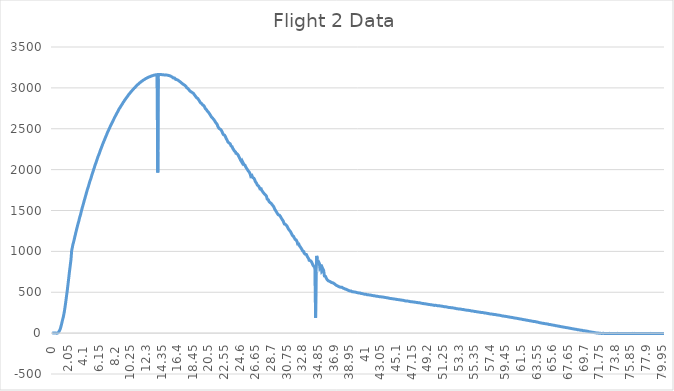
| Category | Series 0 |
|---|---|
| 0.0 | 1 |
| 0.05 | 0 |
| 0.1 | -1 |
| 0.15 | 1 |
| 0.2 | 1 |
| 0.25 | 1 |
| 0.3 | 1 |
| 0.35 | 1 |
| 0.4 | 1 |
| 0.45 | 2 |
| 0.5 | 1 |
| 0.55 | 1 |
| 0.6 | -2 |
| 0.65 | -7 |
| 0.7 | 0 |
| 0.75 | 3 |
| 0.8 | 6 |
| 0.85 | 12 |
| 0.9 | 20 |
| 0.95 | 29 |
| 1.0 | 38 |
| 1.05 | 50 |
| 1.1 | 63 |
| 1.15 | 82 |
| 1.2 | 99 |
| 1.25 | 118 |
| 1.3 | 140 |
| 1.35 | 158 |
| 1.4 | 176 |
| 1.45 | 194 |
| 1.5 | 218 |
| 1.55 | 241 |
| 1.6 | 267 |
| 1.65 | 297 |
| 1.7 | 328 |
| 1.75 | 362 |
| 1.8 | 396 |
| 1.85 | 432 |
| 1.9 | 468 |
| 1.95 | 502 |
| 2.0 | 538 |
| 2.05 | 579 |
| 2.1 | 617 |
| 2.15 | 657 |
| 2.2 | 698 |
| 2.25 | 740 |
| 2.3 | 777 |
| 2.35 | 813 |
| 2.4 | 851 |
| 2.45 | 889 |
| 2.5 | 939 |
| 2.55 | 1004 |
| 2.6 | 1030 |
| 2.65 | 1051 |
| 2.7 | 1077 |
| 2.75 | 1095 |
| 2.8 | 1111 |
| 2.85 | 1131 |
| 2.9 | 1150 |
| 2.95 | 1172 |
| 3.0 | 1191 |
| 3.05 | 1208 |
| 3.1 | 1231 |
| 3.15 | 1249 |
| 3.2 | 1268 |
| 3.25 | 1287 |
| 3.3 | 1305 |
| 3.35 | 1324 |
| 3.4 | 1341 |
| 3.45 | 1357 |
| 3.5 | 1373 |
| 3.55 | 1395 |
| 3.6 | 1413 |
| 3.65 | 1430 |
| 3.7 | 1444 |
| 3.75 | 1462 |
| 3.8 | 1482 |
| 3.85 | 1500 |
| 3.9 | 1518 |
| 3.95 | 1537 |
| 4.0 | 1552 |
| 4.05 | 1567 |
| 4.1 | 1585 |
| 4.15 | 1602 |
| 4.2 | 1620 |
| 4.25 | 1636 |
| 4.3 | 1652 |
| 4.35 | 1669 |
| 4.4 | 1685 |
| 4.45 | 1702 |
| 4.5 | 1719 |
| 4.55 | 1735 |
| 4.6 | 1752 |
| 4.65 | 1766 |
| 4.7 | 1780 |
| 4.75 | 1795 |
| 4.8 | 1811 |
| 4.85 | 1827 |
| 4.9 | 1844 |
| 4.95 | 1859 |
| 5.0 | 1872 |
| 5.05 | 1885 |
| 5.1 | 1899 |
| 5.15 | 1916 |
| 5.2 | 1933 |
| 5.25 | 1947 |
| 5.3 | 1961 |
| 5.35 | 1975 |
| 5.4 | 1989 |
| 5.45 | 2005 |
| 5.5 | 2018 |
| 5.55 | 2032 |
| 5.6 | 2048 |
| 5.65 | 2059 |
| 5.7 | 2074 |
| 5.75 | 2086 |
| 5.8 | 2100 |
| 5.85 | 2114 |
| 5.9 | 2128 |
| 5.95 | 2143 |
| 6.0 | 2156 |
| 6.05 | 2169 |
| 6.1 | 2181 |
| 6.15 | 2191 |
| 6.2 | 2202 |
| 6.25 | 2217 |
| 6.3 | 2230 |
| 6.35 | 2244 |
| 6.4 | 2256 |
| 6.45 | 2267 |
| 6.5 | 2280 |
| 6.55 | 2292 |
| 6.6 | 2305 |
| 6.65 | 2318 |
| 6.7 | 2329 |
| 6.75 | 2340 |
| 6.8 | 2350 |
| 6.85 | 2362 |
| 6.9 | 2373 |
| 6.95 | 2386 |
| 7.0 | 2398 |
| 7.05 | 2408 |
| 7.1 | 2419 |
| 7.15 | 2429 |
| 7.2 | 2442 |
| 7.25 | 2453 |
| 7.3 | 2465 |
| 7.35 | 2474 |
| 7.4 | 2484 |
| 7.45 | 2493 |
| 7.5 | 2504 |
| 7.55 | 2514 |
| 7.6 | 2525 |
| 7.65 | 2536 |
| 7.7 | 2544 |
| 7.75 | 2553 |
| 7.8 | 2563 |
| 7.85 | 2572 |
| 7.9 | 2583 |
| 7.95 | 2593 |
| 8.0 | 2602 |
| 8.05 | 2611 |
| 8.1 | 2621 |
| 8.15 | 2631 |
| 8.2 | 2640 |
| 8.25 | 2649 |
| 8.3 | 2658 |
| 8.35 | 2666 |
| 8.4 | 2675 |
| 8.45 | 2684 |
| 8.5 | 2693 |
| 8.55 | 2701 |
| 8.6 | 2710 |
| 8.65 | 2717 |
| 8.7 | 2727 |
| 8.75 | 2736 |
| 8.8 | 2746 |
| 8.85 | 2750 |
| 8.9 | 2759 |
| 8.95 | 2767 |
| 9.0 | 2775 |
| 9.05 | 2783 |
| 9.1 | 2789 |
| 9.15 | 2797 |
| 9.2 | 2804 |
| 9.25 | 2813 |
| 9.3 | 2820 |
| 9.35 | 2827 |
| 9.4 | 2833 |
| 9.45 | 2840 |
| 9.5 | 2848 |
| 9.55 | 2855 |
| 9.6 | 2860 |
| 9.65 | 2868 |
| 9.7 | 2874 |
| 9.75 | 2881 |
| 9.8 | 2887 |
| 9.85 | 2893 |
| 9.9 | 2899 |
| 9.95 | 2907 |
| 10.0 | 2914 |
| 10.05 | 2919 |
| 10.1 | 2925 |
| 10.15 | 2930 |
| 10.2 | 2936 |
| 10.25 | 2942 |
| 10.3 | 2948 |
| 10.35 | 2954 |
| 10.4 | 2959 |
| 10.45 | 2964 |
| 10.5 | 2967 |
| 10.55 | 2974 |
| 10.6 | 2980 |
| 10.65 | 2986 |
| 10.7 | 2991 |
| 10.75 | 2996 |
| 10.8 | 3001 |
| 10.85 | 3006 |
| 10.9 | 3009 |
| 10.95 | 3015 |
| 11.0 | 3020 |
| 11.05 | 3025 |
| 11.1 | 3031 |
| 11.15 | 3034 |
| 11.2 | 3039 |
| 11.25 | 3042 |
| 11.3 | 3045 |
| 11.35 | 3050 |
| 11.4 | 3055 |
| 11.45 | 3058 |
| 11.5 | 3063 |
| 11.55 | 3067 |
| 11.6 | 3070 |
| 11.65 | 3074 |
| 11.7 | 3077 |
| 11.75 | 3081 |
| 11.8 | 3084 |
| 11.85 | 3087 |
| 11.9 | 3091 |
| 11.95 | 3095 |
| 12.0 | 3096 |
| 12.05 | 3099 |
| 12.1 | 3102 |
| 12.15 | 3106 |
| 12.2 | 3108 |
| 12.25 | 3113 |
| 12.3 | 3113 |
| 12.35 | 3117 |
| 12.4 | 3119 |
| 12.45 | 3122 |
| 12.5 | 3124 |
| 12.55 | 3127 |
| 12.6 | 3129 |
| 12.65 | 3131 |
| 12.7 | 3134 |
| 12.75 | 3136 |
| 12.8 | 3136 |
| 12.85 | 3138 |
| 12.9 | 3141 |
| 12.95 | 3142 |
| 13.0 | 3145 |
| 13.05 | 3145 |
| 13.1 | 3148 |
| 13.15 | 3149 |
| 13.2 | 3150 |
| 13.25 | 3151 |
| 13.3 | 3154 |
| 13.35 | 3155 |
| 13.4 | 3155 |
| 13.45 | 3157 |
| 13.5 | 3158 |
| 13.55 | 3158 |
| 13.6 | 3160 |
| 13.65 | 3161 |
| 13.7 | 3161 |
| 13.75 | 3162 |
| 13.8 | 3164 |
| 13.85 | 1966 |
| 13.9 | 3113 |
| 13.95 | 3164 |
| 14.0 | 3164 |
| 14.05 | 3166 |
| 14.1 | 3164 |
| 14.15 | 3164 |
| 14.2 | 3164 |
| 14.25 | 3164 |
| 14.3 | 3162 |
| 14.35 | 3164 |
| 14.4 | 3161 |
| 14.45 | 3161 |
| 14.5 | 3160 |
| 14.55 | 3161 |
| 14.6 | 3160 |
| 14.65 | 3158 |
| 14.7 | 3158 |
| 14.75 | 3158 |
| 14.8 | 3158 |
| 14.85 | 3159 |
| 14.9 | 3157 |
| 14.95 | 3159 |
| 15.0 | 3157 |
| 15.05 | 3158 |
| 15.1 | 3155 |
| 15.15 | 3155 |
| 15.2 | 3155 |
| 15.25 | 3152 |
| 15.3 | 3151 |
| 15.35 | 3148 |
| 15.4 | 3145 |
| 15.45 | 3147 |
| 15.5 | 3145 |
| 15.55 | 3141 |
| 15.6 | 3140 |
| 15.65 | 3138 |
| 15.7 | 3135 |
| 15.75 | 3132 |
| 15.8 | 3128 |
| 15.85 | 3125 |
| 15.9 | 3120 |
| 15.95 | 3118 |
| 16.0 | 3120 |
| 16.05 | 3120 |
| 16.1 | 3116 |
| 16.15 | 3110 |
| 16.2 | 3104 |
| 16.25 | 3105 |
| 16.3 | 3104 |
| 16.35 | 3101 |
| 16.4 | 3100 |
| 16.45 | 3095 |
| 16.5 | 3094 |
| 16.55 | 3088 |
| 16.6 | 3085 |
| 16.65 | 3084 |
| 16.7 | 3080 |
| 16.75 | 3075 |
| 16.8 | 3073 |
| 16.85 | 3072 |
| 16.9 | 3068 |
| 16.95 | 3061 |
| 17.0 | 3057 |
| 17.05 | 3053 |
| 17.1 | 3050 |
| 17.15 | 3048 |
| 17.2 | 3043 |
| 17.25 | 3039 |
| 17.3 | 3037 |
| 17.35 | 3033 |
| 17.4 | 3031 |
| 17.45 | 3027 |
| 17.5 | 3022 |
| 17.55 | 3018 |
| 17.6 | 3010 |
| 17.65 | 3001 |
| 17.7 | 3000 |
| 17.75 | 2997 |
| 17.8 | 2993 |
| 17.85 | 2991 |
| 17.9 | 2983 |
| 17.95 | 2975 |
| 18.0 | 2970 |
| 18.05 | 2965 |
| 18.1 | 2959 |
| 18.15 | 2954 |
| 18.2 | 2955 |
| 18.25 | 2950 |
| 18.3 | 2951 |
| 18.35 | 2950 |
| 18.4 | 2941 |
| 18.45 | 2937 |
| 18.5 | 2935 |
| 18.55 | 2930 |
| 18.6 | 2924 |
| 18.65 | 2921 |
| 18.7 | 2909 |
| 18.75 | 2906 |
| 18.8 | 2901 |
| 18.85 | 2891 |
| 18.9 | 2888 |
| 18.95 | 2878 |
| 19.0 | 2877 |
| 19.05 | 2873 |
| 19.1 | 2870 |
| 19.15 | 2864 |
| 19.2 | 2856 |
| 19.25 | 2851 |
| 19.3 | 2841 |
| 19.35 | 2835 |
| 19.4 | 2829 |
| 19.45 | 2819 |
| 19.5 | 2818 |
| 19.55 | 2814 |
| 19.6 | 2807 |
| 19.65 | 2798 |
| 19.7 | 2796 |
| 19.75 | 2791 |
| 19.8 | 2786 |
| 19.85 | 2785 |
| 19.9 | 2781 |
| 19.95 | 2774 |
| 20.0 | 2765 |
| 20.05 | 2756 |
| 20.1 | 2744 |
| 20.15 | 2740 |
| 20.2 | 2737 |
| 20.25 | 2731 |
| 20.3 | 2726 |
| 20.35 | 2716 |
| 20.4 | 2713 |
| 20.45 | 2709 |
| 20.5 | 2701 |
| 20.55 | 2690 |
| 20.6 | 2688 |
| 20.65 | 2682 |
| 20.7 | 2674 |
| 20.75 | 2668 |
| 20.8 | 2658 |
| 20.85 | 2647 |
| 20.9 | 2642 |
| 20.95 | 2639 |
| 21.0 | 2631 |
| 21.05 | 2628 |
| 21.1 | 2626 |
| 21.15 | 2619 |
| 21.2 | 2613 |
| 21.25 | 2606 |
| 21.3 | 2599 |
| 21.35 | 2588 |
| 21.4 | 2581 |
| 21.45 | 2581 |
| 21.5 | 2571 |
| 21.55 | 2564 |
| 21.6 | 2558 |
| 21.65 | 2551 |
| 21.7 | 2534 |
| 21.75 | 2524 |
| 21.8 | 2515 |
| 21.85 | 2510 |
| 21.9 | 2505 |
| 21.95 | 2500 |
| 22.0 | 2497 |
| 22.05 | 2496 |
| 22.1 | 2491 |
| 22.15 | 2483 |
| 22.2 | 2478 |
| 22.25 | 2466 |
| 22.3 | 2459 |
| 22.35 | 2446 |
| 22.4 | 2436 |
| 22.45 | 2429 |
| 22.5 | 2428 |
| 22.55 | 2424 |
| 22.6 | 2422 |
| 22.65 | 2419 |
| 22.7 | 2410 |
| 22.75 | 2398 |
| 22.8 | 2383 |
| 22.85 | 2371 |
| 22.9 | 2368 |
| 22.95 | 2365 |
| 23.0 | 2356 |
| 23.05 | 2339 |
| 23.1 | 2337 |
| 23.15 | 2334 |
| 23.2 | 2326 |
| 23.25 | 2325 |
| 23.3 | 2323 |
| 23.35 | 2315 |
| 23.4 | 2305 |
| 23.45 | 2291 |
| 23.5 | 2285 |
| 23.55 | 2285 |
| 23.6 | 2280 |
| 23.65 | 2271 |
| 23.7 | 2257 |
| 23.75 | 2248 |
| 23.8 | 2244 |
| 23.85 | 2240 |
| 23.9 | 2227 |
| 23.95 | 2231 |
| 24.0 | 2231 |
| 24.05 | 2216 |
| 24.1 | 2200 |
| 24.15 | 2191 |
| 24.2 | 2191 |
| 24.25 | 2194 |
| 24.3 | 2194 |
| 24.35 | 2189 |
| 24.4 | 2177 |
| 24.45 | 2165 |
| 24.5 | 2156 |
| 24.55 | 2147 |
| 24.6 | 2138 |
| 24.65 | 2128 |
| 24.7 | 2117 |
| 24.75 | 2110 |
| 24.8 | 2102 |
| 24.85 | 2096 |
| 24.9 | 2086 |
| 24.95 | 2101 |
| 25.0 | 2092 |
| 25.05 | 2083 |
| 25.1 | 2074 |
| 25.15 | 2064 |
| 25.2 | 2061 |
| 25.25 | 2058 |
| 25.3 | 2052 |
| 25.35 | 2039 |
| 25.4 | 2029 |
| 25.45 | 2023 |
| 25.5 | 2020 |
| 25.55 | 2017 |
| 25.6 | 2002 |
| 25.65 | 1991 |
| 25.7 | 1986 |
| 25.75 | 1979 |
| 25.8 | 1974 |
| 25.85 | 1970 |
| 25.9 | 1965 |
| 25.95 | 1951 |
| 26.0 | 1934 |
| 26.05 | 1918 |
| 26.1 | 1909 |
| 26.15 | 1925 |
| 26.2 | 1927 |
| 26.25 | 1918 |
| 26.3 | 1903 |
| 26.35 | 1904 |
| 26.4 | 1900 |
| 26.45 | 1895 |
| 26.5 | 1886 |
| 26.55 | 1878 |
| 26.6 | 1868 |
| 26.65 | 1853 |
| 26.7 | 1845 |
| 26.75 | 1842 |
| 26.8 | 1834 |
| 26.85 | 1822 |
| 26.9 | 1811 |
| 26.95 | 1809 |
| 27.0 | 1803 |
| 27.05 | 1802 |
| 27.1 | 1802 |
| 27.15 | 1791 |
| 27.2 | 1778 |
| 27.25 | 1765 |
| 27.3 | 1767 |
| 27.35 | 1768 |
| 27.4 | 1766 |
| 27.45 | 1752 |
| 27.5 | 1744 |
| 27.55 | 1738 |
| 27.6 | 1733 |
| 27.65 | 1724 |
| 27.7 | 1714 |
| 27.75 | 1713 |
| 27.8 | 1707 |
| 27.85 | 1701 |
| 27.9 | 1695 |
| 27.95 | 1692 |
| 28.0 | 1690 |
| 28.05 | 1685 |
| 28.1 | 1676 |
| 28.15 | 1657 |
| 28.2 | 1640 |
| 28.25 | 1631 |
| 28.3 | 1633 |
| 28.35 | 1631 |
| 28.4 | 1621 |
| 28.45 | 1608 |
| 28.5 | 1604 |
| 28.55 | 1602 |
| 28.6 | 1596 |
| 28.65 | 1590 |
| 28.7 | 1585 |
| 28.75 | 1584 |
| 28.8 | 1578 |
| 28.85 | 1571 |
| 28.9 | 1565 |
| 28.95 | 1559 |
| 29.0 | 1554 |
| 29.05 | 1551 |
| 29.1 | 1537 |
| 29.15 | 1528 |
| 29.2 | 1514 |
| 29.25 | 1502 |
| 29.3 | 1500 |
| 29.35 | 1498 |
| 29.4 | 1485 |
| 29.45 | 1478 |
| 29.5 | 1468 |
| 29.55 | 1467 |
| 29.6 | 1458 |
| 29.65 | 1448 |
| 29.7 | 1448 |
| 29.75 | 1448 |
| 29.8 | 1443 |
| 29.85 | 1437 |
| 29.9 | 1434 |
| 29.95 | 1425 |
| 30.0 | 1416 |
| 30.05 | 1407 |
| 30.1 | 1397 |
| 30.15 | 1392 |
| 30.2 | 1391 |
| 30.25 | 1380 |
| 30.3 | 1371 |
| 30.35 | 1356 |
| 30.4 | 1348 |
| 30.45 | 1335 |
| 30.5 | 1332 |
| 30.55 | 1334 |
| 30.6 | 1330 |
| 30.65 | 1333 |
| 30.7 | 1325 |
| 30.75 | 1316 |
| 30.8 | 1310 |
| 30.85 | 1300 |
| 30.9 | 1291 |
| 30.95 | 1280 |
| 31.0 | 1273 |
| 31.05 | 1265 |
| 31.1 | 1262 |
| 31.15 | 1258 |
| 31.2 | 1249 |
| 31.25 | 1241 |
| 31.3 | 1235 |
| 31.35 | 1225 |
| 31.4 | 1214 |
| 31.45 | 1207 |
| 31.5 | 1195 |
| 31.55 | 1191 |
| 31.6 | 1184 |
| 31.65 | 1184 |
| 31.7 | 1179 |
| 31.75 | 1166 |
| 31.8 | 1160 |
| 31.85 | 1148 |
| 31.9 | 1144 |
| 31.95 | 1141 |
| 32.0 | 1140 |
| 32.05 | 1132 |
| 32.1 | 1131 |
| 32.15 | 1112 |
| 32.2 | 1089 |
| 32.25 | 1083 |
| 32.3 | 1092 |
| 32.35 | 1089 |
| 32.4 | 1072 |
| 32.45 | 1061 |
| 32.5 | 1064 |
| 32.55 | 1054 |
| 32.6 | 1043 |
| 32.65 | 1039 |
| 32.7 | 1036 |
| 32.75 | 1024 |
| 32.8 | 1013 |
| 32.85 | 1005 |
| 32.9 | 1014 |
| 32.95 | 1014 |
| 33.0 | 997 |
| 33.05 | 977 |
| 33.1 | 977 |
| 33.15 | 969 |
| 33.2 | 965 |
| 33.25 | 965 |
| 33.3 | 965 |
| 33.35 | 961 |
| 33.4 | 954 |
| 33.45 | 938 |
| 33.5 | 935 |
| 33.55 | 923 |
| 33.6 | 917 |
| 33.65 | 907 |
| 33.7 | 891 |
| 33.75 | 889 |
| 33.8 | 890 |
| 33.85 | 887 |
| 33.9 | 883 |
| 33.95 | 882 |
| 34.0 | 873 |
| 34.05 | 869 |
| 34.1 | 854 |
| 34.15 | 845 |
| 34.2 | 832 |
| 34.25 | 828 |
| 34.3 | 818 |
| 34.35 | 820 |
| 34.4 | 814 |
| 34.45 | 806 |
| 34.5 | 799 |
| 34.55 | 187 |
| 34.6 | 751 |
| 34.65 | 829 |
| 34.7 | 945 |
| 34.75 | 895 |
| 34.8 | 862 |
| 34.85 | 873 |
| 34.9 | 873 |
| 34.95 | 871 |
| 35.0 | 870 |
| 35.05 | 850 |
| 35.1 | 803 |
| 35.15 | 815 |
| 35.2 | 821 |
| 35.25 | 839 |
| 35.3 | 795 |
| 35.35 | 759 |
| 35.4 | 763 |
| 35.45 | 773 |
| 35.5 | 787 |
| 35.55 | 780 |
| 35.6 | 767 |
| 35.65 | 738 |
| 35.7 | 699 |
| 35.75 | 690 |
| 35.8 | 694 |
| 35.85 | 693 |
| 35.9 | 689 |
| 35.95 | 673 |
| 36.0 | 685 |
| 36.05 | 655 |
| 36.1 | 655 |
| 36.15 | 644 |
| 36.2 | 640 |
| 36.25 | 644 |
| 36.3 | 629 |
| 36.35 | 635 |
| 36.4 | 634 |
| 36.45 | 634 |
| 36.5 | 628 |
| 36.55 | 622 |
| 36.6 | 619 |
| 36.65 | 618 |
| 36.7 | 615 |
| 36.75 | 611 |
| 36.8 | 616 |
| 36.85 | 609 |
| 36.9 | 610 |
| 36.95 | 607 |
| 37.0 | 601 |
| 37.05 | 614 |
| 37.1 | 598 |
| 37.15 | 590 |
| 37.2 | 588 |
| 37.25 | 585 |
| 37.3 | 584 |
| 37.35 | 579 |
| 37.4 | 579 |
| 37.45 | 575 |
| 37.5 | 573 |
| 37.55 | 571 |
| 37.6 | 570 |
| 37.65 | 566 |
| 37.7 | 564 |
| 37.75 | 562 |
| 37.8 | 560 |
| 37.85 | 562 |
| 37.9 | 562 |
| 37.95 | 563 |
| 38.0 | 561 |
| 38.05 | 558 |
| 38.1 | 554 |
| 38.15 | 551 |
| 38.2 | 547 |
| 38.25 | 546 |
| 38.3 | 545 |
| 38.35 | 542 |
| 38.4 | 539 |
| 38.45 | 539 |
| 38.5 | 537 |
| 38.55 | 538 |
| 38.6 | 535 |
| 38.65 | 531 |
| 38.7 | 527 |
| 38.75 | 528 |
| 38.8 | 524 |
| 38.85 | 523 |
| 38.9 | 521 |
| 38.95 | 518 |
| 39.0 | 516 |
| 39.05 | 516 |
| 39.1 | 517 |
| 39.15 | 515 |
| 39.2 | 515 |
| 39.25 | 515 |
| 39.3 | 509 |
| 39.35 | 506 |
| 39.4 | 506 |
| 39.45 | 505 |
| 39.5 | 505 |
| 39.55 | 503 |
| 39.6 | 504 |
| 39.65 | 503 |
| 39.7 | 501 |
| 39.75 | 500 |
| 39.8 | 501 |
| 39.85 | 498 |
| 39.9 | 497 |
| 39.95 | 496 |
| 40.0 | 495 |
| 40.05 | 495 |
| 40.1 | 494 |
| 40.15 | 493 |
| 40.2 | 491 |
| 40.25 | 490 |
| 40.3 | 491 |
| 40.35 | 491 |
| 40.4 | 490 |
| 40.45 | 490 |
| 40.5 | 487 |
| 40.55 | 484 |
| 40.6 | 485 |
| 40.65 | 484 |
| 40.7 | 483 |
| 40.75 | 482 |
| 40.8 | 480 |
| 40.85 | 478 |
| 40.9 | 479 |
| 40.95 | 478 |
| 41.0 | 476 |
| 41.05 | 476 |
| 41.1 | 474 |
| 41.15 | 475 |
| 41.2 | 472 |
| 41.25 | 471 |
| 41.3 | 470 |
| 41.35 | 470 |
| 41.4 | 470 |
| 41.45 | 469 |
| 41.5 | 467 |
| 41.55 | 468 |
| 41.6 | 467 |
| 41.65 | 467 |
| 41.7 | 468 |
| 41.75 | 465 |
| 41.8 | 465 |
| 41.85 | 462 |
| 41.9 | 462 |
| 41.95 | 461 |
| 42.0 | 460 |
| 42.05 | 459 |
| 42.1 | 459 |
| 42.15 | 458 |
| 42.2 | 458 |
| 42.25 | 457 |
| 42.3 | 456 |
| 42.35 | 455 |
| 42.4 | 454 |
| 42.45 | 452 |
| 42.5 | 452 |
| 42.55 | 452 |
| 42.6 | 451 |
| 42.65 | 451 |
| 42.7 | 450 |
| 42.75 | 449 |
| 42.8 | 448 |
| 42.85 | 448 |
| 42.9 | 447 |
| 42.95 | 445 |
| 43.0 | 445 |
| 43.05 | 444 |
| 43.1 | 445 |
| 43.15 | 443 |
| 43.2 | 443 |
| 43.25 | 442 |
| 43.3 | 442 |
| 43.35 | 441 |
| 43.4 | 441 |
| 43.45 | 437 |
| 43.5 | 437 |
| 43.55 | 438 |
| 43.6 | 438 |
| 43.65 | 436 |
| 43.7 | 436 |
| 43.75 | 434 |
| 43.8 | 433 |
| 43.85 | 433 |
| 43.9 | 431 |
| 43.95 | 430 |
| 44.0 | 431 |
| 44.05 | 430 |
| 44.1 | 428 |
| 44.15 | 428 |
| 44.2 | 428 |
| 44.25 | 426 |
| 44.3 | 425 |
| 44.35 | 424 |
| 44.4 | 424 |
| 44.45 | 423 |
| 44.5 | 424 |
| 44.55 | 423 |
| 44.6 | 421 |
| 44.65 | 421 |
| 44.7 | 420 |
| 44.75 | 419 |
| 44.8 | 419 |
| 44.85 | 417 |
| 44.9 | 417 |
| 44.95 | 416 |
| 45.0 | 416 |
| 45.05 | 415 |
| 45.1 | 415 |
| 45.15 | 413 |
| 45.2 | 412 |
| 45.25 | 412 |
| 45.3 | 411 |
| 45.35 | 410 |
| 45.4 | 409 |
| 45.45 | 407 |
| 45.5 | 409 |
| 45.55 | 407 |
| 45.6 | 405 |
| 45.65 | 406 |
| 45.7 | 405 |
| 45.75 | 404 |
| 45.8 | 404 |
| 45.85 | 405 |
| 45.9 | 403 |
| 45.95 | 402 |
| 46.0 | 402 |
| 46.05 | 401 |
| 46.1 | 400 |
| 46.15 | 397 |
| 46.2 | 397 |
| 46.25 | 395 |
| 46.3 | 396 |
| 46.35 | 394 |
| 46.4 | 394 |
| 46.45 | 394 |
| 46.5 | 395 |
| 46.55 | 393 |
| 46.6 | 392 |
| 46.65 | 391 |
| 46.7 | 391 |
| 46.75 | 389 |
| 46.8 | 389 |
| 46.85 | 388 |
| 46.9 | 387 |
| 46.95 | 386 |
| 47.0 | 385 |
| 47.05 | 384 |
| 47.1 | 384 |
| 47.15 | 384 |
| 47.2 | 383 |
| 47.25 | 384 |
| 47.3 | 382 |
| 47.35 | 382 |
| 47.4 | 381 |
| 47.45 | 381 |
| 47.5 | 378 |
| 47.55 | 377 |
| 47.6 | 377 |
| 47.65 | 379 |
| 47.7 | 376 |
| 47.75 | 376 |
| 47.8 | 374 |
| 47.85 | 375 |
| 47.9 | 374 |
| 47.95 | 375 |
| 48.0 | 372 |
| 48.05 | 371 |
| 48.1 | 370 |
| 48.15 | 371 |
| 48.2 | 371 |
| 48.25 | 369 |
| 48.3 | 367 |
| 48.35 | 367 |
| 48.4 | 365 |
| 48.45 | 365 |
| 48.5 | 364 |
| 48.55 | 364 |
| 48.6 | 363 |
| 48.65 | 363 |
| 48.7 | 361 |
| 48.75 | 362 |
| 48.8 | 359 |
| 48.85 | 360 |
| 48.9 | 359 |
| 48.95 | 358 |
| 49.0 | 358 |
| 49.05 | 359 |
| 49.1 | 356 |
| 49.15 | 355 |
| 49.2 | 357 |
| 49.25 | 353 |
| 49.3 | 355 |
| 49.35 | 353 |
| 49.4 | 351 |
| 49.45 | 351 |
| 49.5 | 350 |
| 49.55 | 349 |
| 49.6 | 349 |
| 49.65 | 350 |
| 49.7 | 347 |
| 49.75 | 346 |
| 49.8 | 346 |
| 49.85 | 345 |
| 49.9 | 345 |
| 49.95 | 343 |
| 50.0 | 342 |
| 50.05 | 343 |
| 50.1 | 342 |
| 50.15 | 339 |
| 50.2 | 341 |
| 50.25 | 340 |
| 50.3 | 341 |
| 50.35 | 339 |
| 50.4 | 339 |
| 50.45 | 337 |
| 50.5 | 336 |
| 50.55 | 336 |
| 50.6 | 335 |
| 50.65 | 335 |
| 50.7 | 334 |
| 50.75 | 335 |
| 50.8 | 334 |
| 50.85 | 335 |
| 50.9 | 332 |
| 50.95 | 330 |
| 51.0 | 329 |
| 51.05 | 330 |
| 51.1 | 328 |
| 51.15 | 327 |
| 51.2 | 328 |
| 51.25 | 326 |
| 51.3 | 324 |
| 51.35 | 325 |
| 51.4 | 323 |
| 51.45 | 323 |
| 51.5 | 322 |
| 51.55 | 321 |
| 51.6 | 322 |
| 51.65 | 322 |
| 51.7 | 320 |
| 51.75 | 320 |
| 51.8 | 319 |
| 51.85 | 316 |
| 51.9 | 316 |
| 51.95 | 315 |
| 52.0 | 316 |
| 52.05 | 316 |
| 52.1 | 314 |
| 52.15 | 313 |
| 52.2 | 313 |
| 52.25 | 312 |
| 52.3 | 312 |
| 52.35 | 311 |
| 52.4 | 310 |
| 52.45 | 310 |
| 52.5 | 310 |
| 52.55 | 309 |
| 52.6 | 307 |
| 52.65 | 307 |
| 52.7 | 306 |
| 52.75 | 305 |
| 52.8 | 304 |
| 52.85 | 304 |
| 52.9 | 304 |
| 52.95 | 303 |
| 53.0 | 300 |
| 53.05 | 301 |
| 53.1 | 299 |
| 53.15 | 298 |
| 53.2 | 298 |
| 53.25 | 296 |
| 53.3 | 296 |
| 53.35 | 296 |
| 53.4 | 297 |
| 53.45 | 295 |
| 53.5 | 295 |
| 53.55 | 294 |
| 53.6 | 293 |
| 53.65 | 292 |
| 53.7 | 291 |
| 53.75 | 290 |
| 53.8 | 290 |
| 53.85 | 289 |
| 53.9 | 289 |
| 53.95 | 288 |
| 54.0 | 288 |
| 54.05 | 286 |
| 54.1 | 285 |
| 54.15 | 284 |
| 54.2 | 283 |
| 54.25 | 282 |
| 54.3 | 282 |
| 54.35 | 281 |
| 54.4 | 281 |
| 54.45 | 281 |
| 54.5 | 280 |
| 54.55 | 280 |
| 54.6 | 278 |
| 54.65 | 278 |
| 54.7 | 277 |
| 54.75 | 276 |
| 54.8 | 276 |
| 54.85 | 275 |
| 54.9 | 273 |
| 54.95 | 272 |
| 55.0 | 272 |
| 55.05 | 271 |
| 55.1 | 270 |
| 55.15 | 270 |
| 55.2 | 270 |
| 55.25 | 269 |
| 55.3 | 268 |
| 55.35 | 267 |
| 55.4 | 265 |
| 55.45 | 264 |
| 55.5 | 263 |
| 55.55 | 264 |
| 55.6 | 262 |
| 55.65 | 263 |
| 55.7 | 261 |
| 55.75 | 259 |
| 55.8 | 260 |
| 55.85 | 259 |
| 55.9 | 258 |
| 55.95 | 257 |
| 56.0 | 257 |
| 56.05 | 257 |
| 56.1 | 255 |
| 56.15 | 255 |
| 56.2 | 255 |
| 56.25 | 253 |
| 56.3 | 252 |
| 56.35 | 251 |
| 56.4 | 252 |
| 56.45 | 252 |
| 56.5 | 251 |
| 56.55 | 250 |
| 56.6 | 249 |
| 56.65 | 247 |
| 56.7 | 246 |
| 56.75 | 246 |
| 56.8 | 246 |
| 56.85 | 245 |
| 56.9 | 245 |
| 56.95 | 243 |
| 57.0 | 242 |
| 57.05 | 242 |
| 57.1 | 240 |
| 57.15 | 240 |
| 57.2 | 240 |
| 57.25 | 239 |
| 57.3 | 238 |
| 57.35 | 236 |
| 57.4 | 235 |
| 57.45 | 234 |
| 57.5 | 234 |
| 57.55 | 234 |
| 57.6 | 234 |
| 57.65 | 233 |
| 57.7 | 232 |
| 57.75 | 232 |
| 57.8 | 231 |
| 57.85 | 229 |
| 57.9 | 229 |
| 57.95 | 228 |
| 58.0 | 227 |
| 58.05 | 228 |
| 58.1 | 227 |
| 58.15 | 226 |
| 58.2 | 226 |
| 58.25 | 225 |
| 58.3 | 222 |
| 58.35 | 223 |
| 58.4 | 221 |
| 58.45 | 221 |
| 58.5 | 220 |
| 58.55 | 220 |
| 58.6 | 217 |
| 58.65 | 218 |
| 58.7 | 218 |
| 58.75 | 216 |
| 58.8 | 215 |
| 58.85 | 215 |
| 58.9 | 215 |
| 58.95 | 213 |
| 59.0 | 211 |
| 59.05 | 212 |
| 59.1 | 210 |
| 59.15 | 210 |
| 59.2 | 210 |
| 59.25 | 210 |
| 59.3 | 207 |
| 59.35 | 206 |
| 59.4 | 205 |
| 59.45 | 205 |
| 59.5 | 203 |
| 59.55 | 203 |
| 59.6 | 203 |
| 59.65 | 202 |
| 59.7 | 202 |
| 59.75 | 200 |
| 59.8 | 200 |
| 59.85 | 199 |
| 59.9 | 198 |
| 59.95 | 196 |
| 60.0 | 196 |
| 60.05 | 195 |
| 60.1 | 194 |
| 60.15 | 194 |
| 60.2 | 193 |
| 60.25 | 191 |
| 60.3 | 191 |
| 60.35 | 191 |
| 60.4 | 190 |
| 60.45 | 188 |
| 60.5 | 188 |
| 60.55 | 187 |
| 60.6 | 187 |
| 60.65 | 185 |
| 60.7 | 185 |
| 60.75 | 184 |
| 60.8 | 183 |
| 60.85 | 182 |
| 60.9 | 181 |
| 60.95 | 181 |
| 61.0 | 179 |
| 61.05 | 178 |
| 61.1 | 178 |
| 61.15 | 178 |
| 61.2 | 176 |
| 61.25 | 175 |
| 61.3 | 174 |
| 61.35 | 174 |
| 61.4 | 173 |
| 61.45 | 172 |
| 61.5 | 171 |
| 61.55 | 171 |
| 61.6 | 171 |
| 61.65 | 168 |
| 61.7 | 167 |
| 61.75 | 167 |
| 61.8 | 165 |
| 61.85 | 165 |
| 61.9 | 164 |
| 61.95 | 164 |
| 62.0 | 163 |
| 62.05 | 163 |
| 62.1 | 162 |
| 62.15 | 160 |
| 62.2 | 158 |
| 62.25 | 157 |
| 62.3 | 157 |
| 62.35 | 156 |
| 62.4 | 156 |
| 62.45 | 155 |
| 62.5 | 152 |
| 62.55 | 152 |
| 62.6 | 152 |
| 62.65 | 151 |
| 62.7 | 150 |
| 62.75 | 150 |
| 62.8 | 148 |
| 62.85 | 149 |
| 62.9 | 147 |
| 62.95 | 146 |
| 63.0 | 145 |
| 63.05 | 145 |
| 63.1 | 145 |
| 63.15 | 143 |
| 63.2 | 141 |
| 63.25 | 141 |
| 63.3 | 141 |
| 63.35 | 141 |
| 63.4 | 137 |
| 63.45 | 138 |
| 63.5 | 137 |
| 63.55 | 136 |
| 63.6 | 133 |
| 63.65 | 135 |
| 63.7 | 133 |
| 63.75 | 132 |
| 63.8 | 131 |
| 63.85 | 129 |
| 63.9 | 129 |
| 63.95 | 127 |
| 64.0 | 127 |
| 64.05 | 126 |
| 64.1 | 125 |
| 64.15 | 124 |
| 64.2 | 123 |
| 64.25 | 122 |
| 64.3 | 121 |
| 64.35 | 121 |
| 64.4 | 120 |
| 64.45 | 120 |
| 64.5 | 116 |
| 64.55 | 117 |
| 64.6 | 117 |
| 64.65 | 116 |
| 64.7 | 115 |
| 64.75 | 113 |
| 64.8 | 113 |
| 64.85 | 113 |
| 64.9 | 111 |
| 64.95 | 110 |
| 65.0 | 112 |
| 65.05 | 109 |
| 65.1 | 110 |
| 65.15 | 106 |
| 65.2 | 106 |
| 65.25 | 107 |
| 65.3 | 106 |
| 65.35 | 104 |
| 65.4 | 102 |
| 65.45 | 102 |
| 65.5 | 102 |
| 65.55 | 99 |
| 65.6 | 99 |
| 65.65 | 100 |
| 65.7 | 97 |
| 65.75 | 97 |
| 65.8 | 96 |
| 65.85 | 96 |
| 65.9 | 95 |
| 65.95 | 95 |
| 66.0 | 92 |
| 66.05 | 91 |
| 66.1 | 91 |
| 66.15 | 89 |
| 66.2 | 89 |
| 66.25 | 87 |
| 66.3 | 87 |
| 66.35 | 86 |
| 66.4 | 84 |
| 66.45 | 83 |
| 66.5 | 84 |
| 66.55 | 82 |
| 66.6 | 82 |
| 66.65 | 81 |
| 66.7 | 81 |
| 66.75 | 79 |
| 66.8 | 78 |
| 66.85 | 77 |
| 66.9 | 77 |
| 66.95 | 76 |
| 67.0 | 75 |
| 67.05 | 73 |
| 67.1 | 73 |
| 67.15 | 71 |
| 67.2 | 71 |
| 67.25 | 71 |
| 67.3 | 70 |
| 67.35 | 69 |
| 67.4 | 68 |
| 67.45 | 68 |
| 67.5 | 65 |
| 67.55 | 66 |
| 67.6 | 65 |
| 67.65 | 64 |
| 67.7 | 64 |
| 67.75 | 63 |
| 67.8 | 63 |
| 67.85 | 61 |
| 67.9 | 60 |
| 67.95 | 59 |
| 68.0 | 58 |
| 68.05 | 58 |
| 68.1 | 57 |
| 68.15 | 55 |
| 68.2 | 55 |
| 68.25 | 53 |
| 68.3 | 53 |
| 68.35 | 52 |
| 68.4 | 51 |
| 68.45 | 50 |
| 68.5 | 50 |
| 68.55 | 49 |
| 68.6 | 48 |
| 68.65 | 46 |
| 68.7 | 46 |
| 68.75 | 46 |
| 68.8 | 44 |
| 68.85 | 44 |
| 68.9 | 42 |
| 68.95 | 43 |
| 69.0 | 43 |
| 69.05 | 41 |
| 69.1 | 41 |
| 69.15 | 40 |
| 69.2 | 38 |
| 69.25 | 37 |
| 69.3 | 37 |
| 69.35 | 35 |
| 69.4 | 35 |
| 69.45 | 32 |
| 69.5 | 34 |
| 69.55 | 33 |
| 69.6 | 32 |
| 69.65 | 30 |
| 69.7 | 31 |
| 69.75 | 29 |
| 69.8 | 29 |
| 69.85 | 29 |
| 69.9 | 26 |
| 69.95 | 27 |
| 70.0 | 25 |
| 70.05 | 24 |
| 70.1 | 24 |
| 70.15 | 22 |
| 70.2 | 20 |
| 70.25 | 22 |
| 70.3 | 19 |
| 70.35 | 17 |
| 70.4 | 18 |
| 70.45 | 18 |
| 70.5 | 17 |
| 70.55 | 16 |
| 70.6 | 16 |
| 70.65 | 15 |
| 70.7 | 13 |
| 70.75 | 12 |
| 70.8 | 12 |
| 70.85 | 11 |
| 70.9 | 10 |
| 70.95 | 10 |
| 71.0 | 9 |
| 71.05 | 8 |
| 71.1 | 8 |
| 71.15 | 6 |
| 71.2 | 5 |
| 71.25 | 5 |
| 71.3 | 4 |
| 71.35 | 2 |
| 71.4 | 2 |
| 71.45 | 1 |
| 71.5 | 1 |
| 71.55 | 0 |
| 71.6 | 1 |
| 71.65 | -1 |
| 71.7 | 0 |
| 71.75 | -2 |
| 71.8 | -1 |
| 71.85 | -3 |
| 71.9 | -2 |
| 71.95 | -4 |
| 72.0 | -4 |
| 72.05 | -4 |
| 72.1 | -4 |
| 72.15 | -5 |
| 72.2 | -3 |
| 72.25 | -5 |
| 72.3 | -4 |
| 72.35 | -3 |
| 72.4 | -5 |
| 72.45 | -4 |
| 72.5 | -4 |
| 72.55 | -5 |
| 72.6 | -4 |
| 72.65 | -5 |
| 72.7 | -3 |
| 72.75 | -4 |
| 72.8 | -5 |
| 72.85 | -4 |
| 72.9 | -5 |
| 72.95 | -6 |
| 73.0 | -4 |
| 73.05 | -4 |
| 73.1 | -3 |
| 73.15 | -4 |
| 73.2 | -3 |
| 73.25 | -4 |
| 73.3 | -3 |
| 73.35 | -4 |
| 73.4 | -4 |
| 73.45 | -4 |
| 73.5 | -5 |
| 73.55 | -4 |
| 73.6 | -5 |
| 73.65 | -5 |
| 73.7 | -4 |
| 73.75 | -4 |
| 73.8 | -4 |
| 73.85 | -5 |
| 73.9 | -4 |
| 73.95 | -4 |
| 74.0 | -4 |
| 74.05 | -4 |
| 74.1 | -4 |
| 74.15 | -3 |
| 74.2 | -4 |
| 74.25 | -4 |
| 74.3 | -4 |
| 74.35 | -4 |
| 74.4 | -4 |
| 74.45 | -5 |
| 74.5 | -4 |
| 74.55 | -2 |
| 74.6 | -4 |
| 74.65 | -5 |
| 74.7 | -5 |
| 74.75 | -4 |
| 74.8 | -3 |
| 74.85 | -4 |
| 74.9 | -4 |
| 74.95 | -4 |
| 75.0 | -5 |
| 75.05 | -5 |
| 75.1 | -5 |
| 75.15 | -5 |
| 75.2 | -5 |
| 75.25 | -4 |
| 75.3 | -4 |
| 75.35 | -4 |
| 75.4 | -5 |
| 75.45 | -4 |
| 75.5 | -4 |
| 75.55 | -5 |
| 75.6 | -5 |
| 75.65 | -5 |
| 75.7 | -5 |
| 75.75 | -5 |
| 75.8 | -5 |
| 75.85 | -4 |
| 75.9 | -4 |
| 75.95 | -4 |
| 76.0 | -5 |
| 76.05 | -5 |
| 76.1 | -3 |
| 76.15 | -5 |
| 76.2 | -4 |
| 76.25 | -5 |
| 76.3 | -4 |
| 76.35 | -5 |
| 76.4 | -3 |
| 76.45 | -4 |
| 76.5 | -5 |
| 76.55 | -5 |
| 76.6 | -3 |
| 76.65 | -4 |
| 76.7 | -4 |
| 76.75 | -5 |
| 76.8 | -4 |
| 76.85 | -4 |
| 76.9 | -5 |
| 76.95 | -4 |
| 77.0 | -4 |
| 77.05 | -5 |
| 77.1 | -5 |
| 77.15 | -4 |
| 77.2 | -4 |
| 77.25 | -4 |
| 77.3 | -5 |
| 77.35 | -4 |
| 77.4 | -3 |
| 77.45 | -5 |
| 77.5 | -3 |
| 77.55 | -5 |
| 77.6 | -4 |
| 77.65 | -4 |
| 77.7 | -3 |
| 77.75 | -4 |
| 77.8 | -4 |
| 77.85 | -4 |
| 77.9 | -5 |
| 77.95 | -5 |
| 78.0 | -5 |
| 78.05 | -5 |
| 78.1 | -4 |
| 78.15 | -4 |
| 78.2 | -4 |
| 78.25 | -4 |
| 78.3 | -4 |
| 78.35 | -4 |
| 78.4 | -3 |
| 78.45 | -4 |
| 78.5 | -3 |
| 78.55 | -5 |
| 78.6 | -5 |
| 78.65 | -4 |
| 78.7 | -4 |
| 78.75 | -4 |
| 78.8 | -4 |
| 78.85 | -4 |
| 78.9 | -6 |
| 78.95 | -4 |
| 79.0 | -4 |
| 79.05 | -5 |
| 79.1 | -4 |
| 79.15 | -4 |
| 79.2 | -6 |
| 79.25 | -5 |
| 79.3 | -5 |
| 79.35 | -4 |
| 79.4 | -4 |
| 79.45 | -4 |
| 79.5 | -3 |
| 79.55 | -6 |
| 79.6 | -4 |
| 79.65 | -3 |
| 79.7 | -4 |
| 79.75 | -5 |
| 79.8 | -3 |
| 79.85 | -4 |
| 79.9 | -3 |
| 79.95 | -4 |
| 80.0 | -4 |
| 80.05 | -3 |
| 80.1 | -5 |
| 80.15 | -4 |
| 80.2 | -3 |
| 80.25 | -4 |
| 80.3 | -3 |
| 80.35 | -5 |